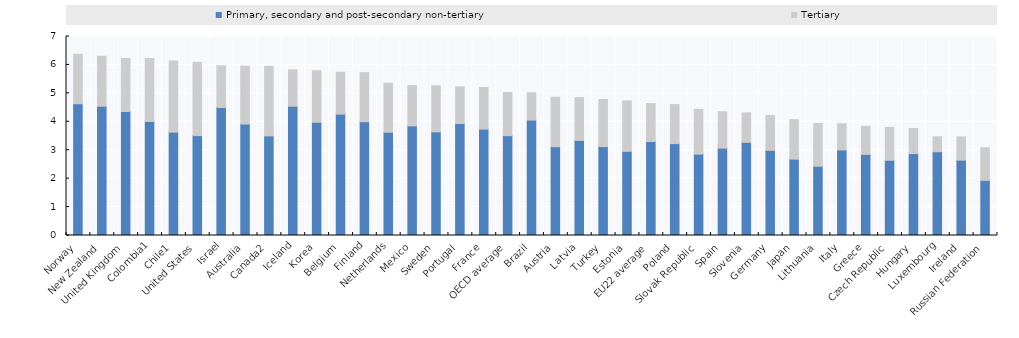
| Category | Primary, secondary and post-secondary non-tertiary | Tertiary |
|---|---|---|
| Norway | 4.636 | 1.739 |
| New Zealand | 4.548 | 1.756 |
| United Kingdom | 4.361 | 1.868 |
| Colombia1 | 4.01 | 2.214 |
| Chile1 | 3.637 | 2.503 |
| United States | 3.514 | 2.576 |
| Israel | 4.502 | 1.469 |
| Australia | 3.921 | 2.034 |
| Canada2 | 3.504 | 2.448 |
| Iceland | 4.547 | 1.282 |
| Korea | 3.982 | 1.815 |
| Belgium | 4.27 | 1.474 |
| Finland | 4.003 | 1.726 |
| Netherlands | 3.633 | 1.725 |
| Mexico | 3.857 | 1.415 |
| Sweden | 3.646 | 1.619 |
| Portugal | 3.94 | 1.288 |
| France | 3.743 | 1.464 |
| OECD average | 3.512 | 1.517 |
| Brazil | 4.061 | 0.959 |
| Austria | 3.122 | 1.742 |
| Latvia | 3.345 | 1.507 |
| Turkey | 3.129 | 1.653 |
| Estonia | 2.959 | 1.774 |
| EU22 average | 3.307 | 1.332 |
| Poland | 3.232 | 1.373 |
| Slovak Republic | 2.863 | 1.575 |
| Spain | 3.073 | 1.28 |
| Slovenia | 3.278 | 1.036 |
| Germany | 2.996 | 1.224 |
| Japan | 2.686 | 1.388 |
| Lithuania | 2.439 | 1.502 |
| Italy | 3.009 | 0.923 |
| Greece | 2.854 | 0.989 |
| Czech Republic | 2.646 | 1.156 |
| Hungary | 2.881 | 0.883 |
| Luxembourg | 2.946 | 0.527 |
| Ireland | 2.65 | 0.819 |
| Russian Federation | 1.939 | 1.148 |